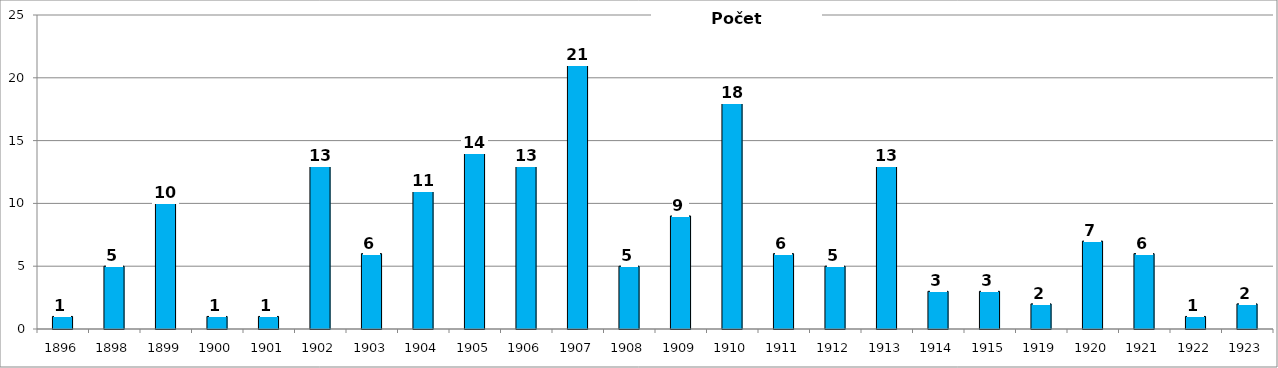
| Category | Počet vysťahovalcov |
|---|---|
| 1896.0 | 1 |
| 1898.0 | 5 |
| 1899.0 | 10 |
| 1900.0 | 1 |
| 1901.0 | 1 |
| 1902.0 | 13 |
| 1903.0 | 6 |
| 1904.0 | 11 |
| 1905.0 | 14 |
| 1906.0 | 13 |
| 1907.0 | 21 |
| 1908.0 | 5 |
| 1909.0 | 9 |
| 1910.0 | 18 |
| 1911.0 | 6 |
| 1912.0 | 5 |
| 1913.0 | 13 |
| 1914.0 | 3 |
| 1915.0 | 3 |
| 1919.0 | 2 |
| 1920.0 | 7 |
| 1921.0 | 6 |
| 1922.0 | 1 |
| 1923.0 | 2 |